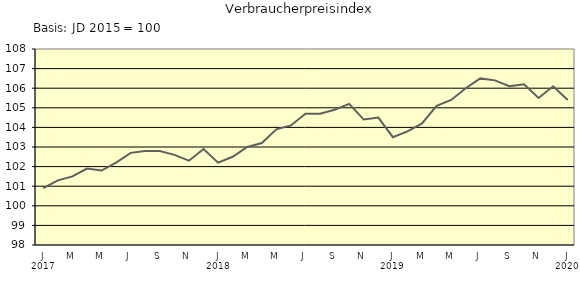
| Category | Series 0 |
|---|---|
| 0 | 100.9 |
| 1 | 101.3 |
| 2 | 101.5 |
| 3 | 101.9 |
| 4 | 101.8 |
| 5 | 102.2 |
| 6 | 102.7 |
| 7 | 102.8 |
| 8 | 102.8 |
| 9 | 102.6 |
| 10 | 102.3 |
| 11 | 102.9 |
| 12 | 102.2 |
| 13 | 102.5 |
| 14 | 103 |
| 15 | 103.2 |
| 16 | 103.9 |
| 17 | 104.1 |
| 18 | 104.7 |
| 19 | 104.7 |
| 20 | 104.9 |
| 21 | 105.2 |
| 22 | 104.4 |
| 23 | 104.5 |
| 24 | 103.5 |
| 25 | 103.8 |
| 26 | 104.2 |
| 27 | 105.1 |
| 28 | 105.4 |
| 29 | 106 |
| 30 | 106.5 |
| 31 | 106.4 |
| 32 | 106.1 |
| 33 | 106.2 |
| 34 | 105.5 |
| 35 | 106.1 |
| 36 | 105.4 |